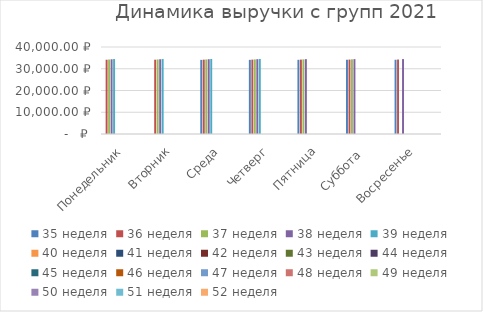
| Category | 35 неделя | 36 неделя | 37 неделя | 38 неделя | 39 неделя | 40 неделя | 41 неделя | 42 неделя | 43 неделя | 44 неделя | 45 неделя | 46 неделя | 47 неделя | 48 неделя | 49 неделя | 50 неделя | 51 неделя | 52 неделя |
|---|---|---|---|---|---|---|---|---|---|---|---|---|---|---|---|---|---|---|
| Понедельник | 0 | 34150.72 | 34252.08 | 34353.44 | 34454.8 |  |  |  |  |  |  |  |  |  |  |  |  |  |
| Вторник | 0 | 34165.2 | 34266.56 | 34367.92 | 34469.28 |  |  |  |  |  |  |  |  |  |  |  |  |  |
| Среда | 34078.32 | 34179.68 | 34281.04 | 34382.4 | 34483.76 |  |  |  |  |  |  |  |  |  |  |  |  |  |
| Четверг | 34092.8 | 34194.16 | 34295.52 | 34396.88 | 34498.24 |  |  |  |  |  |  |  |  |  |  |  |  |  |
| Пятница | 34107.28 | 34208.64 | 34310 | 34411.36 | 0 |  |  |  |  |  |  |  |  |  |  |  |  |  |
| Суббота  | 34121.76 | 34223.12 | 34324.48 | 34425.84 | 0 |  |  |  |  |  |  |  |  |  |  |  |  |  |
| Восресенье | 34136.24 | 34237.6 | 0 | 34440.32 | 0 |  |  |  |  |  |  |  |  |  |  |  |  |  |